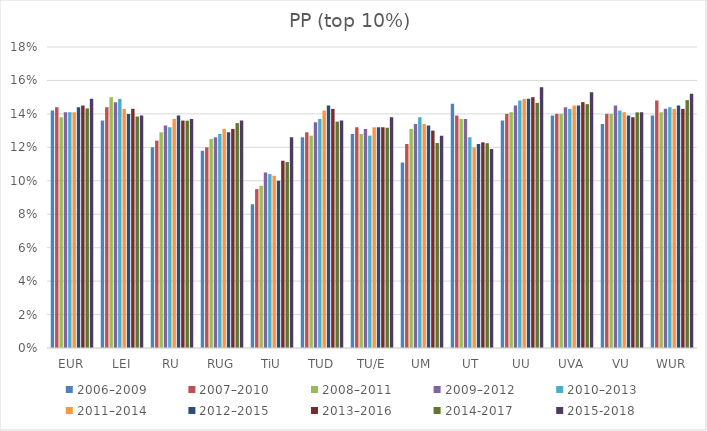
| Category | 2006–2009 | 2007–2010 | 2008–2011 | 2009–2012 | 2010–2013 | 2011–2014 | 2012–2015 | 2013–2016 | 2014-2017 | 2015-2018 |
|---|---|---|---|---|---|---|---|---|---|---|
| EUR | 14.2 | 14.4 | 13.8 | 14.1 | 14.1 | 14.1 | 14.4 | 14.5 | 14.328 | 14.9 |
| LEI | 13.6 | 14.4 | 15 | 14.7 | 14.9 | 14.3 | 14 | 14.3 | 13.839 | 13.9 |
| RU | 12 | 12.4 | 12.9 | 13.3 | 13.2 | 13.7 | 13.9 | 13.6 | 13.593 | 13.7 |
| RUG | 11.8 | 12 | 12.5 | 12.6 | 12.8 | 13.1 | 12.9 | 13.1 | 13.448 | 13.6 |
| TiU | 8.6 | 9.5 | 9.7 | 10.5 | 10.4 | 10.3 | 10 | 11.2 | 11.123 | 12.6 |
| TUD | 12.6 | 12.9 | 12.7 | 13.5 | 13.7 | 14.2 | 14.5 | 14.3 | 13.539 | 13.6 |
| TU/E | 12.8 | 13.2 | 12.8 | 13.1 | 12.7 | 13.2 | 13.2 | 13.2 | 13.171 | 13.8 |
| UM | 11.1 | 12.2 | 13.1 | 13.4 | 13.8 | 13.4 | 13.3 | 13 | 12.256 | 12.7 |
| UT | 14.6 | 13.9 | 13.7 | 13.7 | 12.6 | 12 | 12.2 | 12.3 | 12.246 | 11.9 |
| UU | 13.6 | 14 | 14.1 | 14.5 | 14.8 | 14.9 | 14.9 | 15 | 14.659 | 15.6 |
| UVA | 13.9 | 14 | 14 | 14.4 | 14.3 | 14.5 | 14.5 | 14.7 | 14.584 | 15.3 |
| VU | 13.4 | 14 | 14 | 14.5 | 14.2 | 14.1 | 13.9 | 13.8 | 14.092 | 14.1 |
| WUR | 13.9 | 14.8 | 14.1 | 14.3 | 14.4 | 14.3 | 14.5 | 14.3 | 14.824 | 15.2 |